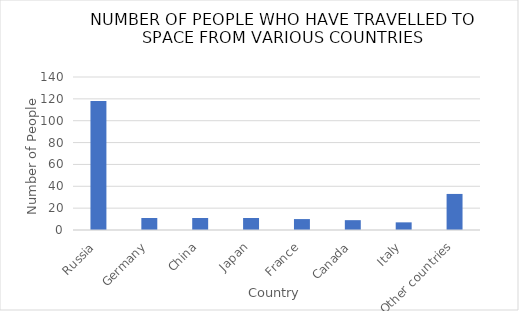
| Category | NUMBER OF PEOPLE |
|---|---|
|  Russia | 118 |
|  Germany | 11 |
|  China | 11 |
|  Japan | 11 |
|  France | 10 |
|  Canada | 9 |
|  Italy | 7 |
| Other countries | 33 |